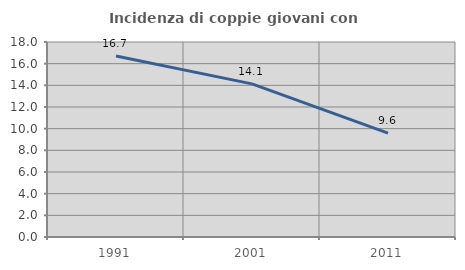
| Category | Incidenza di coppie giovani con figli |
|---|---|
| 1991.0 | 16.702 |
| 2001.0 | 14.133 |
| 2011.0 | 9.586 |